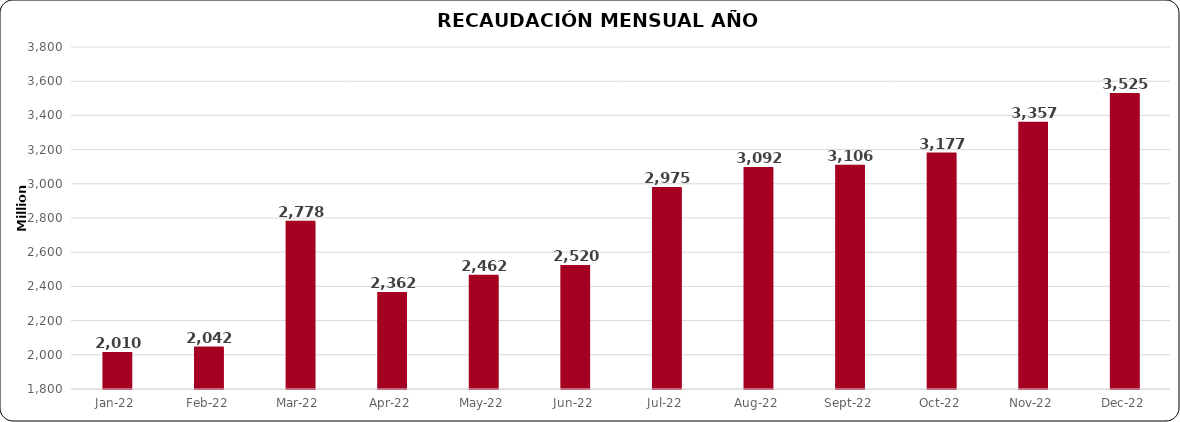
| Category |  RECAUDACIÓN MENSUAL Y ACUMULADA AÑO 2022 |
|---|---|
| 2022-01-01 | 2010060134.78 |
| 2022-02-01 | 2042395123.18 |
| 2022-03-01 | 2777621458.32 |
| 2022-04-01 | 2361924282.53 |
| 2022-05-01 | 2462123733.63 |
| 2022-06-01 | 2519801042.51 |
| 2022-07-01 | 2974986156.66 |
| 2022-08-01 | 3092355995.94 |
| 2022-09-01 | 3105577967.2 |
| 2022-10-01 | 3176923162.32 |
| 2022-11-01 | 3357224160.09 |
| 2022-12-01 | 3524579761.76 |